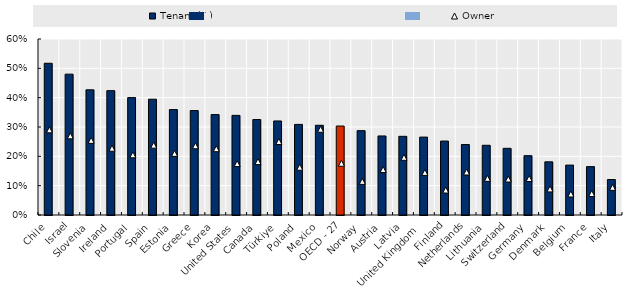
| Category | Tenant (↓) |
|---|---|
| Chile | 0.517 |
| Israel | 0.48 |
| Slovenia | 0.427 |
| Ireland | 0.424 |
| Portugal | 0.4 |
| Spain | 0.395 |
| Estonia | 0.359 |
| Greece | 0.356 |
| Korea | 0.342 |
| United States | 0.34 |
| Canada | 0.325 |
| Türkiye | 0.321 |
| Poland | 0.309 |
| Mexico | 0.306 |
| OECD - 27 | 0.303 |
| Norway | 0.288 |
| Austria | 0.269 |
| Latvia | 0.268 |
| United Kingdom  | 0.266 |
| Finland | 0.252 |
| Netherlands | 0.24 |
| Lithuania | 0.238 |
| Switzerland | 0.227 |
| Germany | 0.202 |
| Denmark | 0.181 |
| Belgium | 0.17 |
| France | 0.165 |
| Italy | 0.121 |